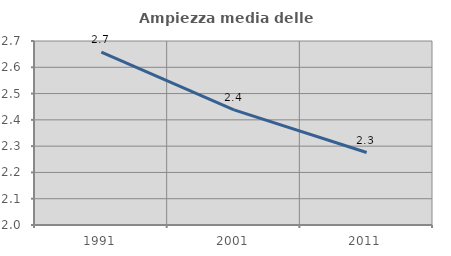
| Category | Ampiezza media delle famiglie |
|---|---|
| 1991.0 | 2.658 |
| 2001.0 | 2.438 |
| 2011.0 | 2.276 |